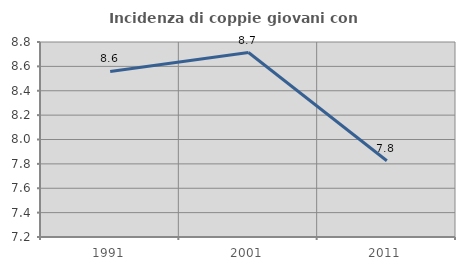
| Category | Incidenza di coppie giovani con figli |
|---|---|
| 1991.0 | 8.559 |
| 2001.0 | 8.714 |
| 2011.0 | 7.826 |